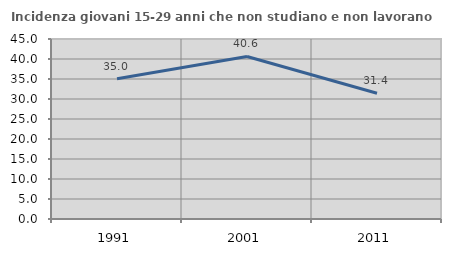
| Category | Incidenza giovani 15-29 anni che non studiano e non lavorano  |
|---|---|
| 1991.0 | 35.043 |
| 2001.0 | 40.636 |
| 2011.0 | 31.441 |